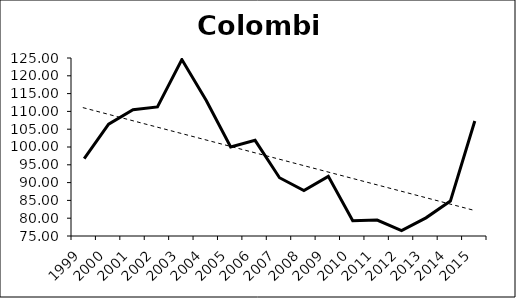
| Category | Series 0 |
|---|---|
| 1999.0 | 96.73 |
| 2000.0 | 106.4 |
| 2001.0 | 110.48 |
| 2002.0 | 111.26 |
| 2003.0 | 124.55 |
| 2004.0 | 113.07 |
| 2005.0 | 100 |
| 2006.0 | 101.87 |
| 2007.0 | 91.37 |
| 2008.0 | 87.79 |
| 2009.0 | 91.76 |
| 2010.0 | 79.29 |
| 2011.0 | 79.46 |
| 2012.0 | 76.51 |
| 2013.0 | 80.1 |
| 2014.0 | 84.81 |
| 2015.0 | 107.32 |